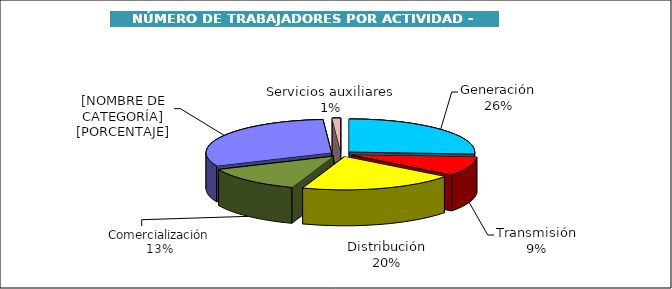
| Category | Series 0 |
|---|---|
| Generación | 25.988 |
| Transmisión | 9.323 |
| Distribución | 20.075 |
| Comercialización | 13.031 |
| Administración | 30.495 |
| Servicios auxiliares | 1.087 |